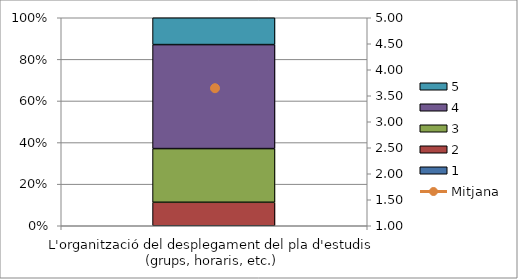
| Category | 1 | 2 | 3 | 4 | 5 |
|---|---|---|---|---|---|
| L'organització del desplegament del pla d'estudis (grups, horaris, etc.) | 0 | 7 | 16 | 31 | 8 |